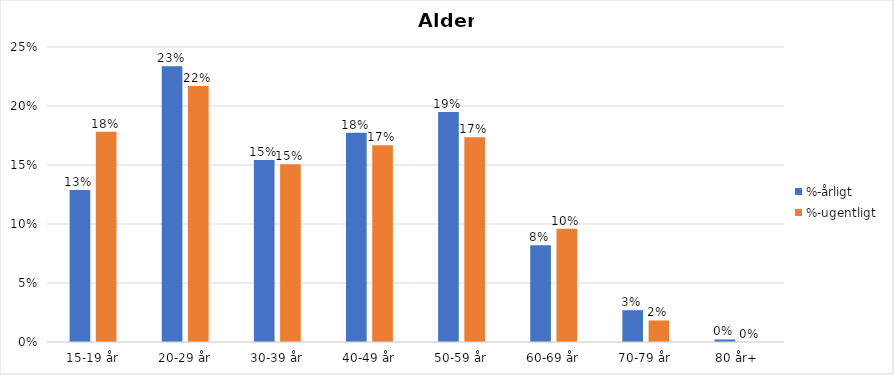
| Category | %-årligt | %-ugentligt |
|---|---|---|
| 15-19 år | 0.129 | 0.178 |
| 20-29 år | 0.234 | 0.217 |
| 30-39 år | 0.154 | 0.151 |
| 40-49 år | 0.177 | 0.167 |
| 50-59 år | 0.195 | 0.174 |
| 60-69 år | 0.082 | 0.096 |
| 70-79 år | 0.027 | 0.018 |
| 80 år+ | 0.002 | 0 |